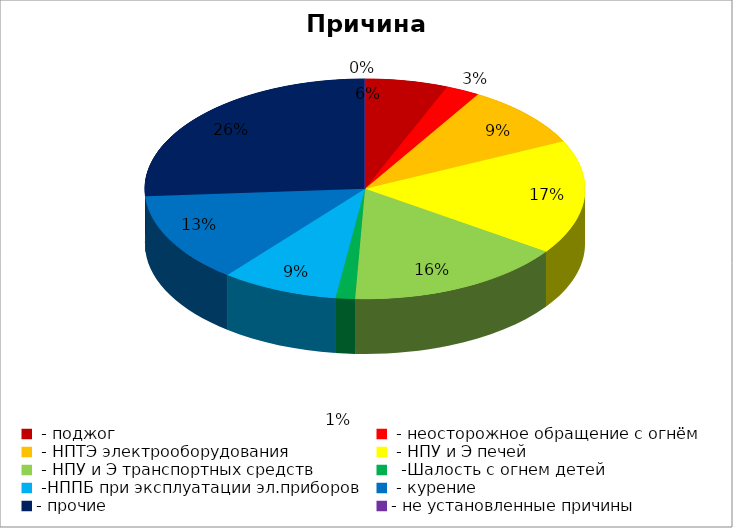
| Category | Причина пожара |
|---|---|
|  - поджог | 17 |
|  - неосторожное обращение с огнём | 7 |
|  - НПТЭ электрооборудования | 26 |
|  - НПУ и Э печей | 47 |
|  - НПУ и Э транспортных средств | 45 |
|   -Шалость с огнем детей | 4 |
|  -НППБ при эксплуатации эл.приборов | 24 |
|  - курение | 37 |
| - прочие | 73 |
| - не установленные причины | 0 |